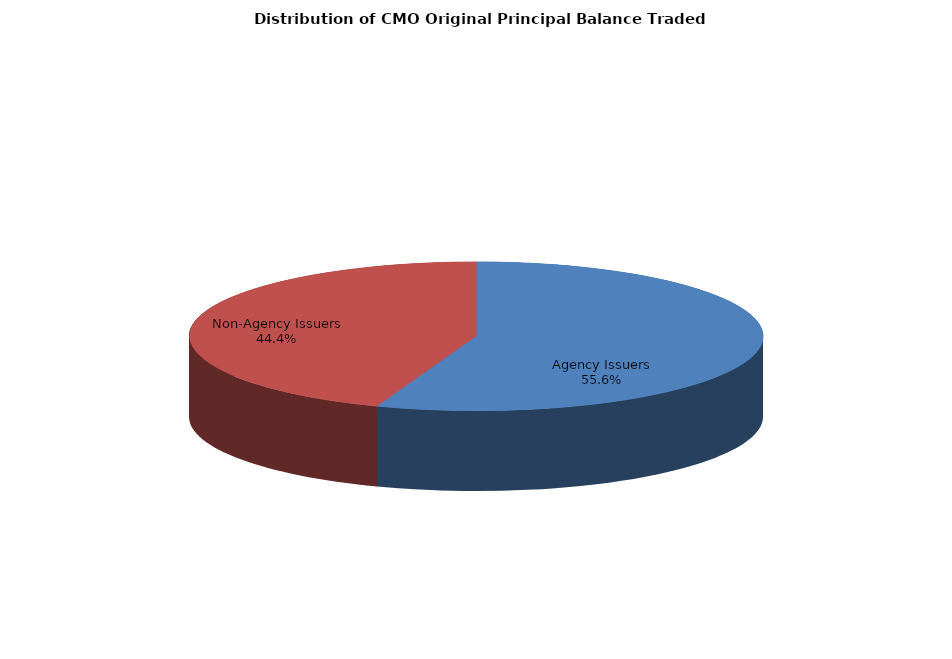
| Category | Series 0 |
|---|---|
| Agency Issuers | 6453102597.867 |
| Non-Agency Issuers | 5154596085.225 |